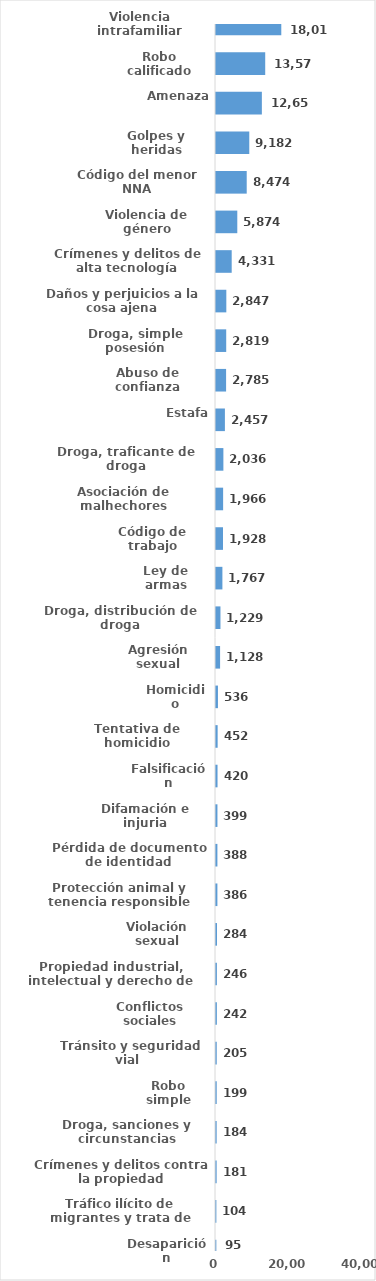
| Category | Series 0 |
|---|---|
| Violencia intrafamiliar | 18013 |
| Robo calificado | 13579 |
| Amenaza | 12652 |
| Golpes y heridas | 9182 |
| Código del menor NNA | 8474 |
| Violencia de género | 5874 |
| Crímenes y delitos de alta tecnología | 4331 |
| Daños y perjuicios a la cosa ajena | 2847 |
| Droga, simple posesión | 2819 |
| Abuso de confianza | 2785 |
| Estafa | 2457 |
| Droga, traficante de droga | 2036 |
| Asociación de malhechores | 1966 |
| Código de trabajo | 1928 |
| Ley de armas | 1767 |
| Droga, distribución de droga | 1229 |
| Agresión sexual | 1128 |
| Homicidio | 536 |
| Tentativa de homicidio | 452 |
| Falsificación | 420 |
| Difamación e injuria | 399 |
| Pérdida de documento de identidad | 388 |
| Protección animal y tenencia responsible | 386 |
| Violación sexual | 284 |
| Propiedad industrial, intelectual y derecho de autor | 246 |
| Conflictos sociales | 242 |
| Tránsito y seguridad vial  | 205 |
| Robo simple | 199 |
| Droga, sanciones y circunstancias agravantes | 184 |
| Crímenes y delitos contra la propiedad | 181 |
| Tráfico ilícito de migrantes y trata de personas | 104 |
| Desaparición | 95 |